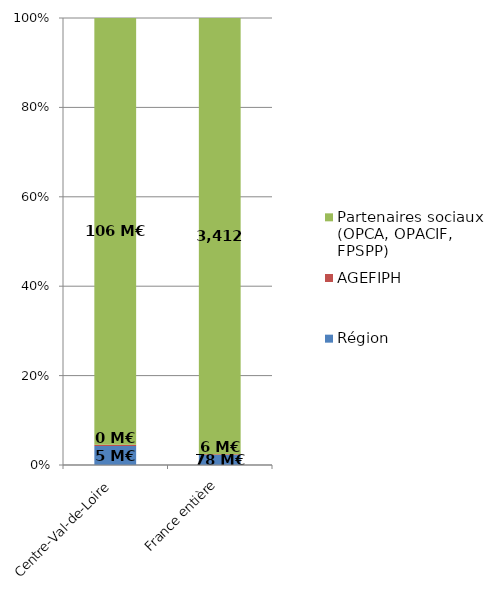
| Category | Région | AGEFIPH | Partenaires sociaux (OPCA, OPACIF, FPSPP) |
|---|---|---|---|
| Centre-Val-de-Loire | 4.699 | 0.304 | 105.722 |
| France entière | 77.612 | 6.161 | 3411.683 |